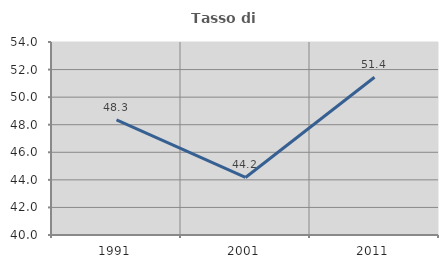
| Category | Tasso di occupazione   |
|---|---|
| 1991.0 | 48.344 |
| 2001.0 | 44.172 |
| 2011.0 | 51.445 |